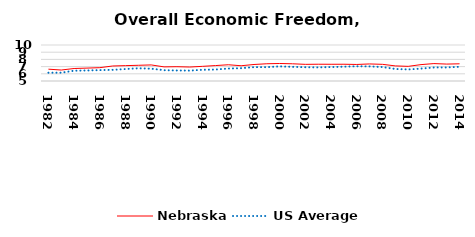
| Category | Nebraska | US Average |
|---|---|---|
| 1982.0 | 6.642 | 6.149 |
| 1983.0 | 6.525 | 6.152 |
| 1984.0 | 6.735 | 6.429 |
| 1985.0 | 6.792 | 6.464 |
| 1986.0 | 6.852 | 6.512 |
| 1987.0 | 7.085 | 6.552 |
| 1988.0 | 7.135 | 6.659 |
| 1989.0 | 7.182 | 6.767 |
| 1990.0 | 7.232 | 6.71 |
| 1991.0 | 6.962 | 6.502 |
| 1992.0 | 6.986 | 6.463 |
| 1993.0 | 6.941 | 6.446 |
| 1994.0 | 7.037 | 6.563 |
| 1995.0 | 7.143 | 6.593 |
| 1996.0 | 7.257 | 6.73 |
| 1997.0 | 7.12 | 6.781 |
| 1998.0 | 7.292 | 6.926 |
| 1999.0 | 7.396 | 6.925 |
| 2000.0 | 7.431 | 7.031 |
| 2001.0 | 7.391 | 6.969 |
| 2002.0 | 7.312 | 6.912 |
| 2003.0 | 7.329 | 6.892 |
| 2004.0 | 7.322 | 6.934 |
| 2005.0 | 7.327 | 6.99 |
| 2006.0 | 7.298 | 7.048 |
| 2007.0 | 7.368 | 7.028 |
| 2008.0 | 7.314 | 6.935 |
| 2009.0 | 7.098 | 6.668 |
| 2010.0 | 7.035 | 6.605 |
| 2011.0 | 7.275 | 6.72 |
| 2012.0 | 7.419 | 6.883 |
| 2013.0 | 7.349 | 6.881 |
| 2014.0 | 7.388 | 6.973 |